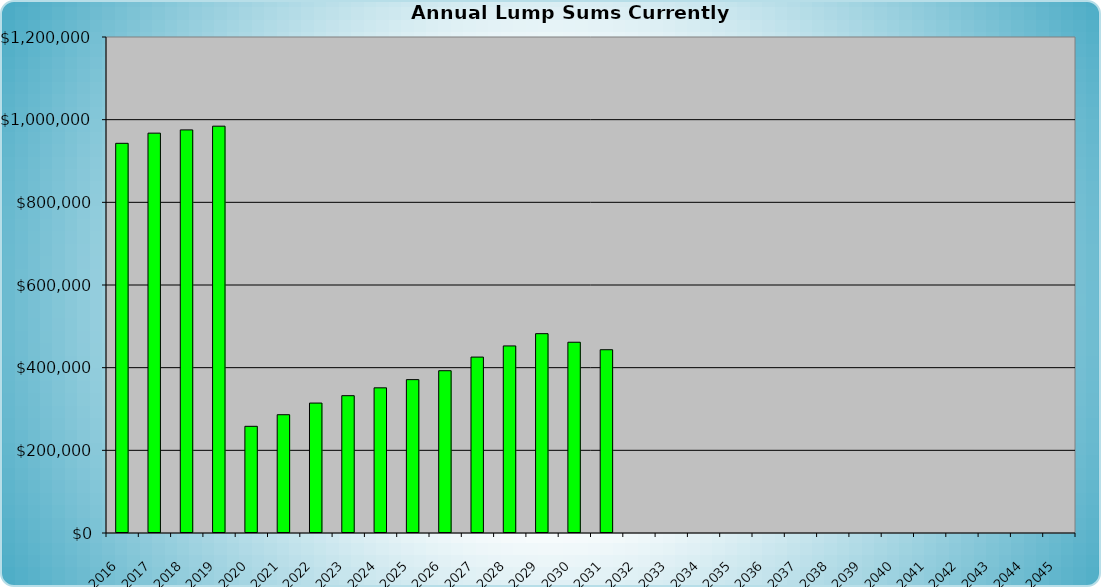
| Category | Amount of Funds Available to Meet All Needs |
|---|---|
| 2016.0 | 942755 |
| 2017.0 | 967372.727 |
| 2018.0 | 975248.094 |
| 2019.0 | 984243.33 |
| 2020.0 | 258113.933 |
| 2021.0 | 286181.098 |
| 2022.0 | 314345.256 |
| 2023.0 | 332207.93 |
| 2024.0 | 351210.52 |
| 2025.0 | 371066.182 |
| 2026.0 | 392647.245 |
| 2027.0 | 425590.155 |
| 2028.0 | 452582.63 |
| 2029.0 | 482283.204 |
| 2030.0 | 461513.019 |
| 2031.0 | 443400.425 |
| 2032.0 | 0 |
| 2033.0 | 0 |
| 2034.0 | 0 |
| 2035.0 | 0 |
| 2036.0 | 0 |
| 2037.0 | 0 |
| 2038.0 | 0 |
| 2039.0 | 0 |
| 2040.0 | 0 |
| 2041.0 | 0 |
| 2042.0 | 0 |
| 2043.0 | 0 |
| 2044.0 | 0 |
| 2045.0 | 0 |